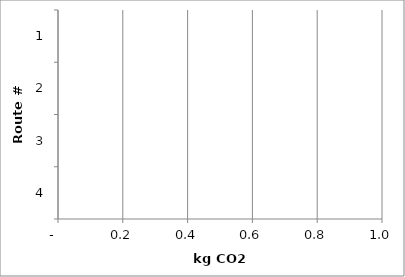
| Category | 1 | 2 | 3 | 4 |
|---|---|---|---|---|
| 4.0 | 0 | 0 | 0 | 0 |
| 3.0 | 0 | 0 | 0 | 0 |
| 2.0 | 0 | 0 | 0 | 0 |
| 1.0 | 0 | 0 | 0 | 0 |